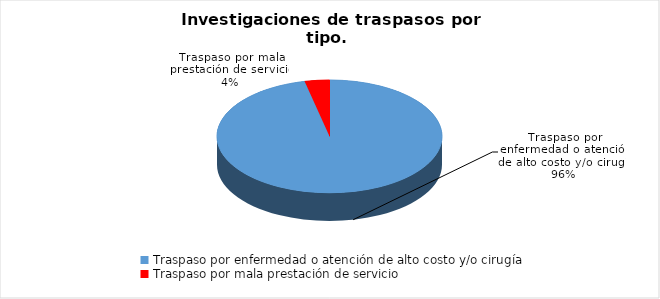
| Category | Series 0 |
|---|---|
| Traspaso por enfermedad o atención de alto costo y/o cirugía | 300 |
| Traspaso por mala prestación de servicio | 11 |